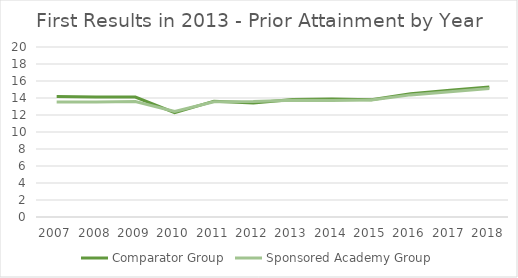
| Category | Comparator Group | Sponsored Academy Group |
|---|---|---|
| 2007.0 | 14.165 | 13.527 |
| 2008.0 | 14.113 | 13.539 |
| 2009.0 | 14.116 | 13.585 |
| 2010.0 | 12.267 | 12.412 |
| 2011.0 | 13.631 | 13.553 |
| 2012.0 | 13.422 | 13.589 |
| 2013.0 | 13.836 | 13.729 |
| 2014.0 | 13.892 | 13.713 |
| 2015.0 | 13.806 | 13.757 |
| 2016.0 | 14.514 | 14.367 |
| 2017.0 | 14.922 | 14.746 |
| 2018.0 | 15.284 | 15.104 |